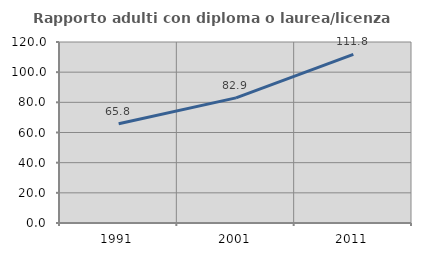
| Category | Rapporto adulti con diploma o laurea/licenza media  |
|---|---|
| 1991.0 | 65.835 |
| 2001.0 | 82.942 |
| 2011.0 | 111.753 |